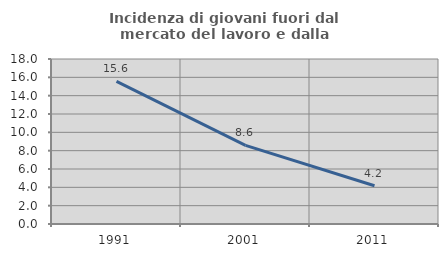
| Category | Incidenza di giovani fuori dal mercato del lavoro e dalla formazione  |
|---|---|
| 1991.0 | 15.556 |
| 2001.0 | 8.571 |
| 2011.0 | 4.167 |